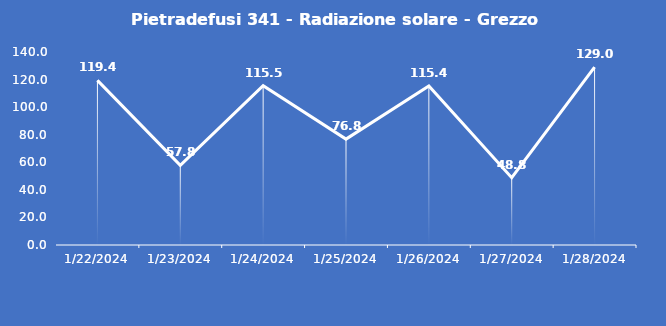
| Category | Pietradefusi 341 - Radiazione solare - Grezzo (W/m2) |
|---|---|
| 1/22/24 | 119.4 |
| 1/23/24 | 57.8 |
| 1/24/24 | 115.5 |
| 1/25/24 | 76.8 |
| 1/26/24 | 115.4 |
| 1/27/24 | 48.8 |
| 1/28/24 | 129 |